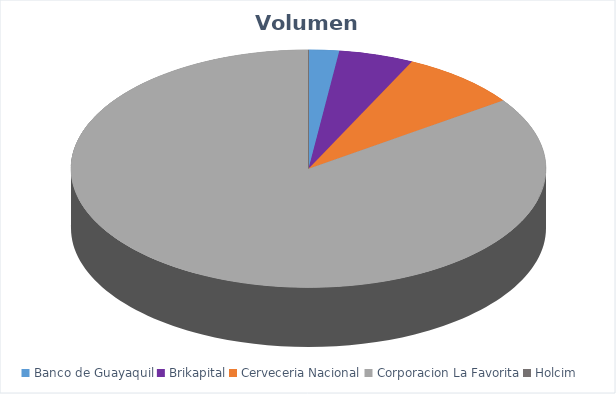
| Category | VOLUMEN ($USD) |
|---|---|
| Banco de Guayaquil | 4068.8 |
| Brikapital | 10000 |
| Cerveceria Nacional | 15930 |
| Corporacion La Favorita | 166456.55 |
| Holcim | 70 |